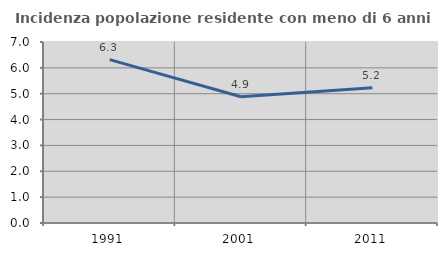
| Category | Incidenza popolazione residente con meno di 6 anni |
|---|---|
| 1991.0 | 6.317 |
| 2001.0 | 4.881 |
| 2011.0 | 5.228 |